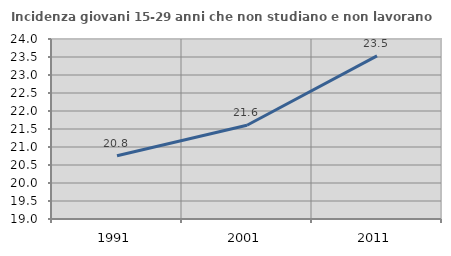
| Category | Incidenza giovani 15-29 anni che non studiano e non lavorano  |
|---|---|
| 1991.0 | 20.755 |
| 2001.0 | 21.605 |
| 2011.0 | 23.529 |